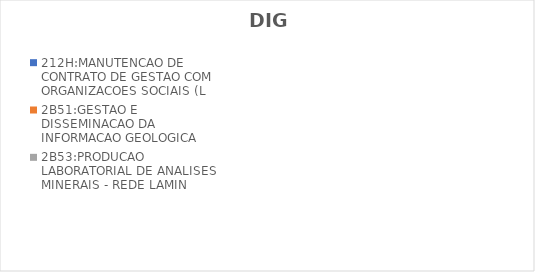
| Category | 212H:MANUTENCAO DE CONTRATO DE GESTAO COM ORGANIZACOES SOCIAIS (L | 2B51:GESTAO E DISSEMINACAO DA INFORMACAO GEOLOGICA | 2B53:PRODUCAO LABORATORIAL DE ANALISES MINERAIS - REDE LAMIN |
|---|---|---|---|
| EXECUTADO | 0 | 0.67 | 0.329 |